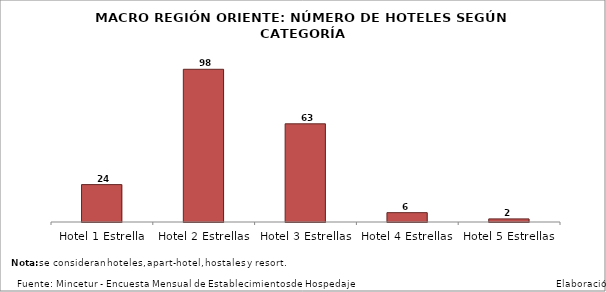
| Category | Series 0 |
|---|---|
| Hotel 1 Estrella | 24 |
| Hotel 2 Estrellas | 98 |
| Hotel 3 Estrellas | 63 |
| Hotel 4 Estrellas | 6 |
| Hotel 5 Estrellas | 2 |